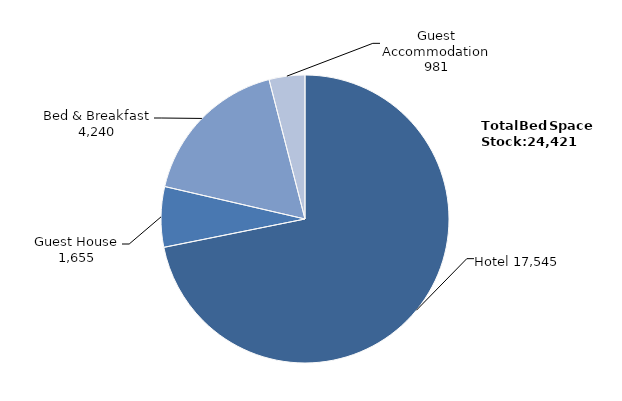
| Category | Series 0 |
|---|---|
| Hotel | 17545 |
| Guest House | 1655 |
| Bed & Breakfast | 4240 |
| Guest Accommodation | 981 |